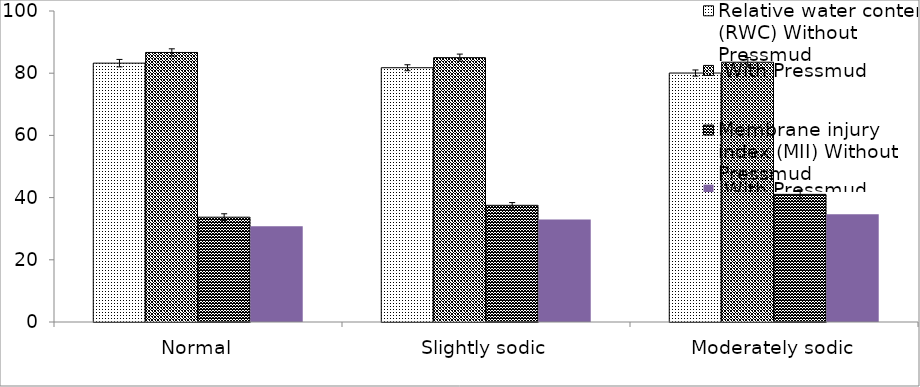
| Category | Relative water content (RWC) | Membrane injury index (MII) |
|---|---|---|
| Normal | 86.67 | 30.82 |
| Slightly sodic | 85 | 32.96 |
| Moderately sodic | 83.54 | 34.61 |